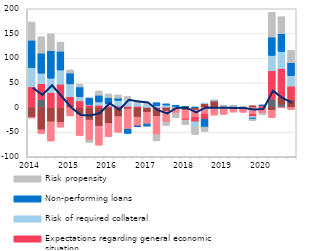
| Category | Other factors | Costs of funding | Competition from other banks | Expectations regarding general economic situation | Risk of required collateral  | Non-performing loans  | Risk propensity |
|---|---|---|---|---|---|---|---|
| 2014.0 | 0.8 | -19.9 | -1.7 | 41 | 39.1 | 55.5 | 36.9 |
| nan | 16.1 | -45.3 | -7.7 | 31.9 | 21.4 | 40.8 | 33.2 |
| nan | 0 | -29 | -39.1 | 30.4 | 28.9 | 55.7 | 34.4 |
| nan | 0 | -30.3 | -9.6 | 47.3 | 28.6 | 38.1 | 18.7 |
| 2015.0 | 0 | 5.3 | -17.2 | 16.4 | 26.1 | 22.1 | 6.2 |
| nan | 0 | -14.5 | -42.3 | 13.3 | 8.7 | 19.6 | 6 |
| nan | -0.9 | -24.7 | -41.2 | 5.2 | 0.6 | 13.5 | -4.1 |
| nan | 0.5 | -38.1 | -38.3 | 4.2 | 6.5 | 13.7 | 8.7 |
| 2016.0 | 0 | -32.5 | -26.6 | 2.8 | 4.8 | 12.6 | 7.3 |
| nan | 0 | -18.6 | -31.7 | 2.8 | 11.4 | 4.8 | 6.6 |
| nan | 0 | -3.2 | -40.9 | 2.6 | 11.7 | -8.5 | 8 |
| nan | 0 | -19.7 | -17.5 | 2.6 | 6.4 | -2 | 5.6 |
| 2017.0 | 0 | -9.9 | -23.6 | 0.3 | 6.6 | -4.3 | 1.9 |
| nan | 0 | -17.9 | -37.2 | 0.4 | 3.4 | 5.9 | -12.7 |
| nan | 0 | -7.4 | -22.4 | 0.6 | 4.3 | 2.5 | -6.8 |
| nan | 0 | -2.2 | -9.3 | 0.1 | 2.2 | 2.2 | -9.5 |
| 2018.0 | 0 | -5.5 | -17.5 | -2.5 | 0 | 1.9 | -9.6 |
| nan | 0 | -5.2 | -14.4 | -9.5 | -9.1 | 0.3 | -16.5 |
| nan | 0 | 8.2 | -13.3 | -10.8 | 0.3 | -15.6 | -8.9 |
| nan | 0 | 13.5 | -15.5 | 0.1 | 0.3 | 0.3 | 0.1 |
| 2019.0 | 0 | 0 | -14 | 0.1 | 2.4 | 0.3 | 0.1 |
| nan | 0 | 2.3 | -9.4 | 0.1 | 0.3 | 0.3 | 0.1 |
| nan | 0 | 0 | -9.9 | 0.1 | 0.4 | 0.4 | 0.1 |
| nan | 0 | 3.5 | -13.7 | -4.4 | -3.2 | -2.2 | -3.4 |
| 2020.0 | 0 | 0 | -11.9 | 3.7 | 0.4 | 0.4 | -2.6 |
| nan | 16.6 | -5.6 | -15.1 | 57.7 | 31.2 | 37.3 | 50 |
| nan | 6.7 | 15.9 | -0.1 | 55.9 | 35 | 36.1 | 34.5 |
| nan | 0 | 16.2 | -4 | 27.2 | 21.1 | 26.4 | 24.9 |